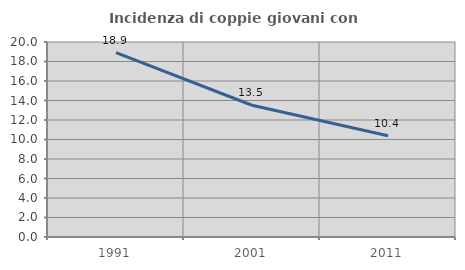
| Category | Incidenza di coppie giovani con figli |
|---|---|
| 1991.0 | 18.919 |
| 2001.0 | 13.514 |
| 2011.0 | 10.38 |